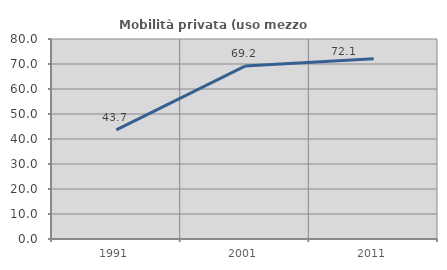
| Category | Mobilità privata (uso mezzo privato) |
|---|---|
| 1991.0 | 43.671 |
| 2001.0 | 69.182 |
| 2011.0 | 72.121 |